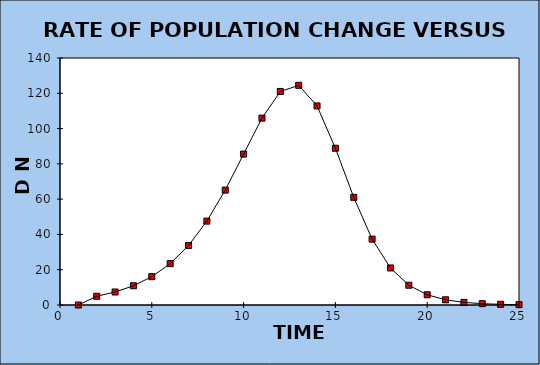
| Category | Series 0 |
|---|---|
| 1.0 | 0 |
| 2.0 | 4.95 |
| 3.0 | 7.363 |
| 4.0 | 10.908 |
| 5.0 | 16.059 |
| 6.0 | 23.426 |
| 7.0 | 33.71 |
| 8.0 | 47.545 |
| 9.0 | 65.128 |
| 10.0 | 85.544 |
| 11.0 | 105.916 |
| 12.0 | 120.999 |
| 13.0 | 124.502 |
| 14.0 | 112.824 |
| 15.0 | 88.853 |
| 16.0 | 61.016 |
| 17.0 | 37.327 |
| 18.0 | 21 |
| 19.0 | 11.202 |
| 20.0 | 5.795 |
| 21.0 | 2.949 |
| 22.0 | 1.488 |
| 23.0 | 0.747 |
| 24.0 | 0.374 |
| 25.0 | 0.187 |